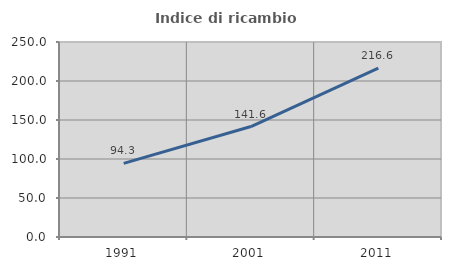
| Category | Indice di ricambio occupazionale  |
|---|---|
| 1991.0 | 94.328 |
| 2001.0 | 141.584 |
| 2011.0 | 216.594 |